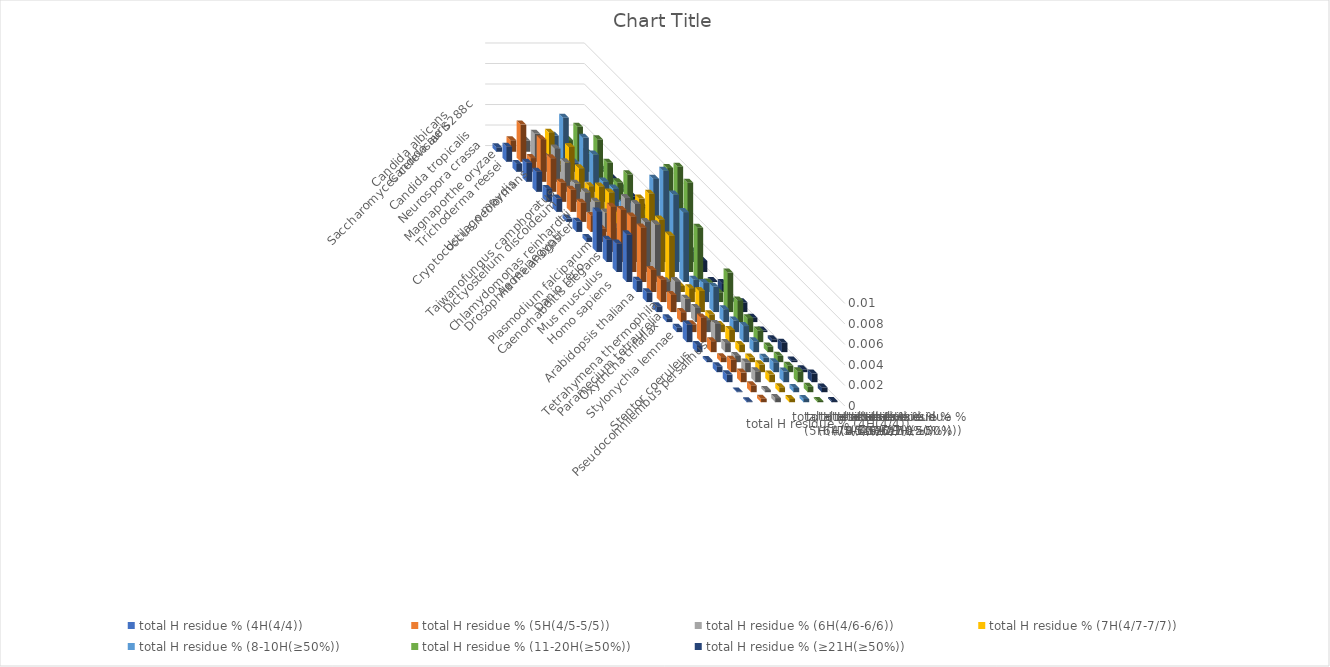
| Category | total H residue % (4H(4/4)) | total H residue % (5H(4/5-5/5)) | total H residue % (6H(4/6-6/6)) | total H residue % (7H(4/7-7/7)) | total H residue % (8-10H(≥50%)) | total H residue % (11-20H(≥50%)) | total H residue % (≥21H(≥50%)) |
|---|---|---|---|---|---|---|---|
| Saccharomyces cerevisiae S288c | 0 | 0.001 | 0.001 | 0.001 | 0.002 | 0.001 | 0 |
| Candida albicans | 0.001 | 0.004 | 0.003 | 0.003 | 0.004 | 0.003 | 0 |
| Candida auris | 0.001 | 0.001 | 0.001 | 0.001 | 0.001 | 0.002 | 0 |
| Candida tropicalis | 0.002 | 0.004 | 0.003 | 0.003 | 0.004 | 0.004 | 0 |
| Neurospora crassa | 0.002 | 0.003 | 0.003 | 0.002 | 0.004 | 0.003 | 0 |
| Magnaporthe oryzae | 0.001 | 0.002 | 0.002 | 0.002 | 0.002 | 0.002 | 0 |
| Trichoderma reesei | 0.001 | 0.002 | 0.002 | 0.002 | 0.002 | 0.004 | 0.001 |
| Cryptococcus neoformans | 0 | 0.002 | 0.002 | 0.003 | 0.002 | 0.002 | 0 |
| Ustilago maydis | 0.001 | 0.002 | 0.002 | 0.002 | 0.003 | 0.002 | 0.001 |
| Taiwanofungus camphoratus | 0 | 0.001 | 0.001 | 0.002 | 0.002 | 0.002 | 0 |
| Dictyostelium discoideum | 0.004 | 0.004 | 0.005 | 0.005 | 0.007 | 0.008 | 0.003 |
| Chlamydomonas reinhardtii | 0.002 | 0.005 | 0.006 | 0.007 | 0.009 | 0.009 | 0.001 |
| Drosophila melanogaster | 0.003 | 0.005 | 0.005 | 0.005 | 0.008 | 0.009 | 0.001 |
| Aedes aegypti | 0.005 | 0.005 | 0.006 | 0.005 | 0.007 | 0.005 | 0 |
| Plasmodium falciparum | 0.001 | 0.002 | 0.001 | 0.001 | 0.001 | 0.001 | 0.001 |
| Caenorhabditis elegans | 0.001 | 0.002 | 0.002 | 0.001 | 0.002 | 0.001 | 0 |
| Danio rerio | 0.001 | 0.002 | 0.001 | 0.002 | 0.002 | 0.004 | 0.001 |
| Mus musculus | 0 | 0.001 | 0.001 | 0.001 | 0.001 | 0.002 | 0 |
| Homo sapiens | 0 | 0.001 | 0.001 | 0.001 | 0.001 | 0.001 | 0 |
| Arabidopsis thaliana | 0.002 | 0.002 | 0.002 | 0.001 | 0.002 | 0.001 | 0 |
| Tetrahymena thermophila | 0.001 | 0.001 | 0.001 | 0.001 | 0.001 | 0.001 | 0.001 |
| Paramecium tetraurelia | 0 | 0 | 0.001 | 0 | 0 | 0.001 | 0 |
| Oxytricha trifallax | 0.001 | 0.001 | 0.001 | 0.001 | 0.001 | 0.001 | 0 |
| Stylonychia lemnae | 0.001 | 0.001 | 0.001 | 0.001 | 0.001 | 0.001 | 0.001 |
| Pseudocohnilembus persalinus | 0 | 0.001 | 0 | 0 | 0 | 0.001 | 0 |
| Stentor coeruleus | 0 | 0 | 0 | 0 | 0 | 0 | 0 |